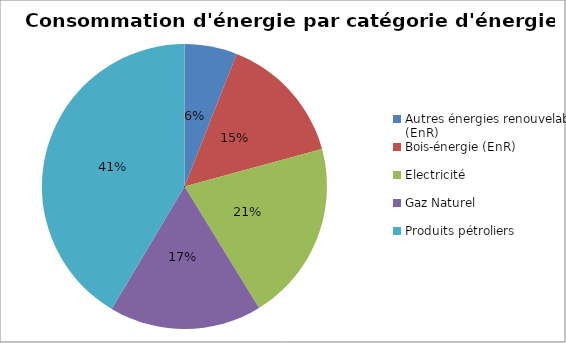
| Category | Series 0 |
|---|---|
| Autres énergies renouvelables (EnR) | 54951.719 |
| Bois-énergie (EnR) | 136371.056 |
| Electricité | 188535.165 |
| Gaz Naturel | 159352.041 |
| Produits pétroliers | 381931.788 |